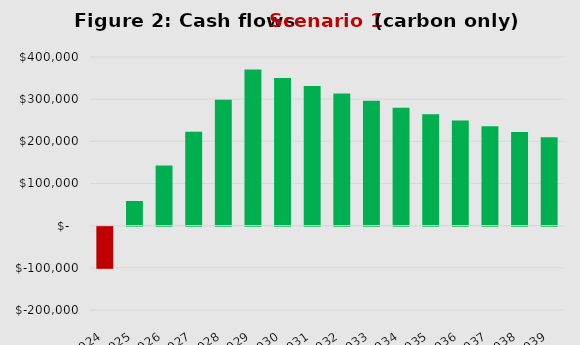
| Category | Series 0 |
|---|---|
| 2024.0 | -100000 |
| 2025.0 | 58500 |
| 2026.0 | 142575 |
| 2027.0 | 222446.25 |
| 2028.0 | 298323.938 |
| 2029.0 | 370407.741 |
| 2030.0 | 350387.354 |
| 2031.0 | 331367.986 |
| 2032.0 | 313299.587 |
| 2033.0 | 296134.607 |
| 2034.0 | 279827.877 |
| 2035.0 | 264336.483 |
| 2036.0 | 249619.659 |
| 2037.0 | 235638.676 |
| 2038.0 | 222356.742 |
| 2039.0 | 209738.905 |